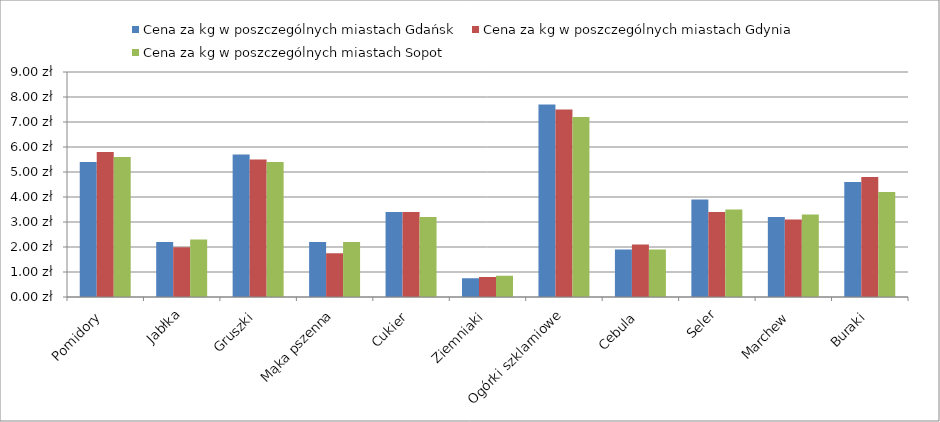
| Category | Cena za kg w poszczególnych miastach |
|---|---|
| Pomidory | 5.6 |
| Jabłka | 2.3 |
| Gruszki | 5.4 |
| Mąka pszenna | 2.2 |
| Cukier | 3.2 |
| Ziemniaki | 0.85 |
| Ogórki szklarniowe | 7.2 |
| Cebula | 1.9 |
| Seler | 3.5 |
| Marchew | 3.3 |
| Buraki | 4.2 |